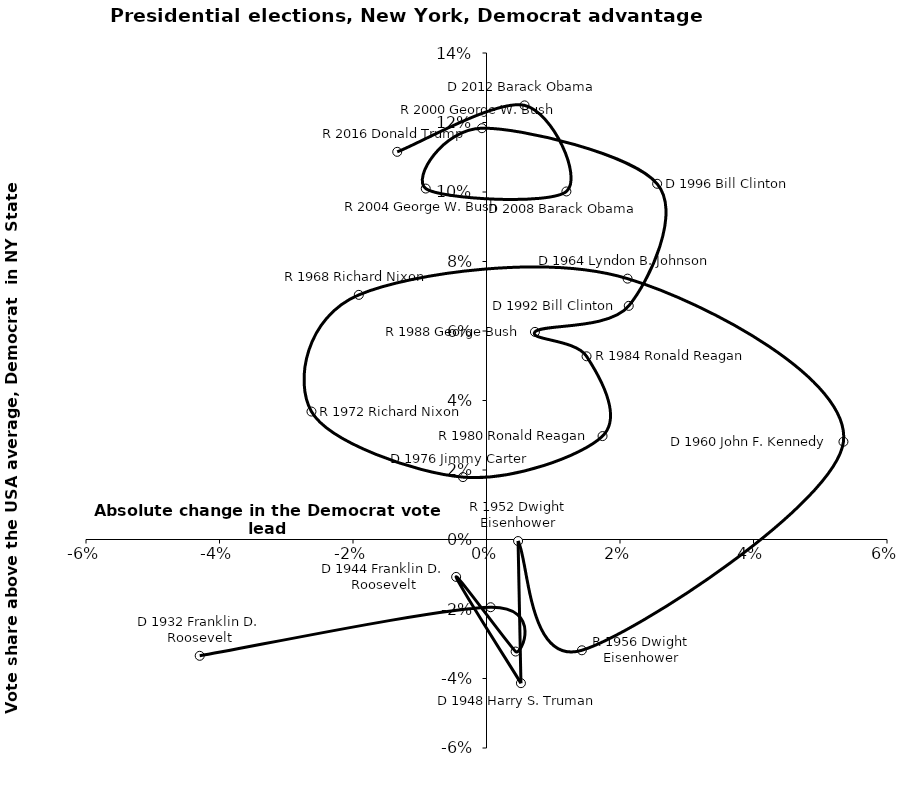
| Category | Series 0 |
|---|---|
| -0.042966284143990396 | -0.033 |
| 0.0006145306099590853 | -0.019 |
| 0.004363158312248372 | -0.032 |
| -0.00454848812728581 | -0.011 |
| 0.005158990889314707 | -0.041 |
| 0.004730411588411004 | 0 |
| 0.014287705363998787 | -0.032 |
| 0.05347470745250313 | 0.028 |
| 0.021132184159763034 | 0.075 |
| -0.01912723365694971 | 0.07 |
| -0.026221733476287895 | 0.037 |
| -0.0035279391857010733 | 0.018 |
| 0.017384999085521352 | 0.03 |
| 0.014989722092606461 | 0.053 |
| 0.007256436863545518 | 0.06 |
| 0.021311974178920168 | 0.067 |
| 0.02556338354115331 | 0.102 |
| -0.0006865556737038481 | 0.118 |
| -0.00910378333024095 | 0.101 |
| 0.011970452047263769 | 0.1 |
| 0.0057007205410933015 | 0.125 |
| -0.013373479959207735 | 0.112 |